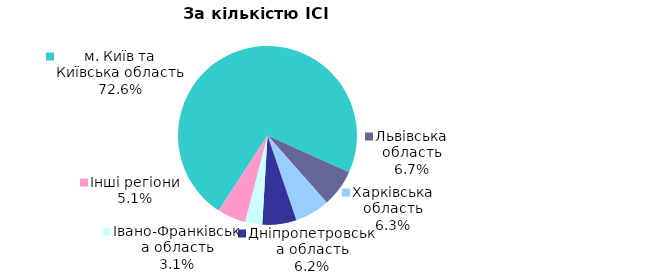
| Category | Series 0 |
|---|---|
| м. Київ та Київська область | 0.726 |
| Львівська область | 0.067 |
| Харківська область | 0.063 |
| Дніпропетровська область | 0.062 |
| Iвано-Франкiвська область | 0.031 |
| Інші регіони | 0.051 |